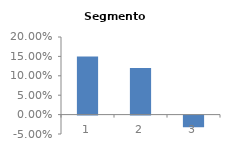
| Category | Segmento 4 |
|---|---|
| 0 | 0.15 |
| 1 | 0.12 |
| 2 | -0.03 |